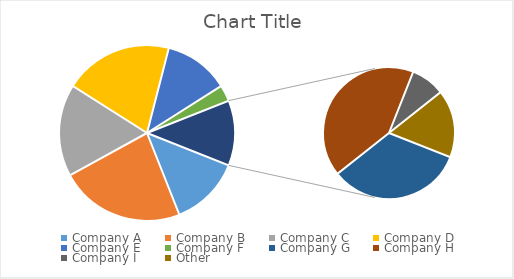
| Category | Series 0 |
|---|---|
| Company A | 0.13 |
| Company B | 0.23 |
| Company C | 0.17 |
| Company D | 0.2 |
| Company E | 0.12 |
| Company F | 0.03 |
| Company G | 0.04 |
| Company H | 0.05 |
| Company I | 0.01 |
| Other | 0.02 |